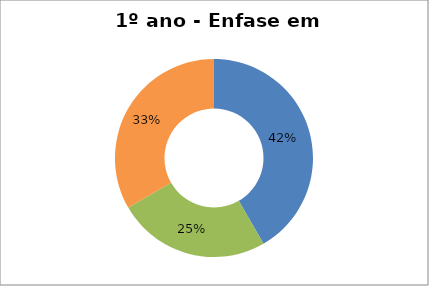
| Category | Series 0 |
|---|---|
| Prog | 5 |
| Tec | 0 |
| MeT | 3 |
| Prof | 4 |